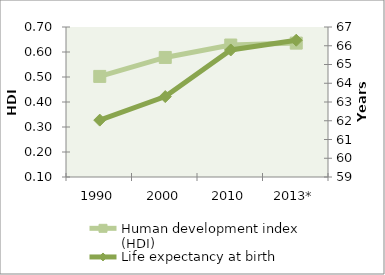
| Category | Human development index (HDI) |
|---|---|
| 1990 | 0.502 |
| 2000 | 0.578 |
| 2010 | 0.628 |
| 2013* | 0.636 |